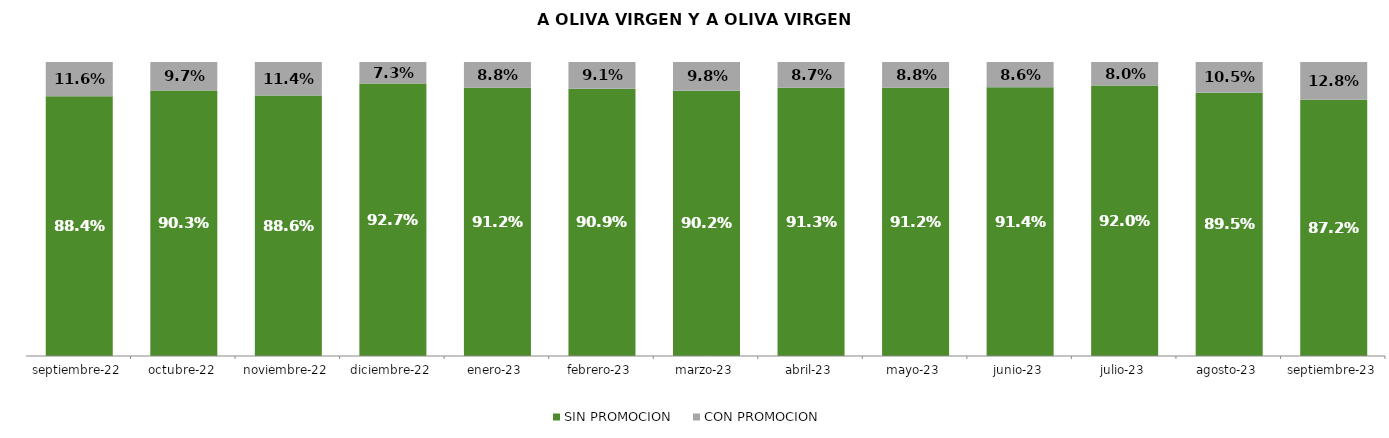
| Category | SIN PROMOCION   | CON PROMOCION   |
|---|---|---|
| 2022-09-01 | 0.884 | 0.116 |
| 2022-10-01 | 0.903 | 0.097 |
| 2022-11-01 | 0.886 | 0.114 |
| 2022-12-01 | 0.927 | 0.073 |
| 2023-01-01 | 0.912 | 0.088 |
| 2023-02-01 | 0.909 | 0.091 |
| 2023-03-01 | 0.902 | 0.098 |
| 2023-04-01 | 0.913 | 0.087 |
| 2023-05-01 | 0.912 | 0.088 |
| 2023-06-01 | 0.914 | 0.086 |
| 2023-07-01 | 0.92 | 0.08 |
| 2023-08-01 | 0.895 | 0.105 |
| 2023-09-01 | 0.872 | 0.128 |